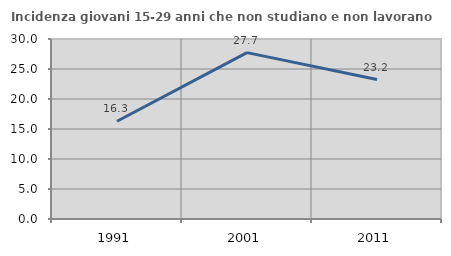
| Category | Incidenza giovani 15-29 anni che non studiano e non lavorano  |
|---|---|
| 1991.0 | 16.294 |
| 2001.0 | 27.726 |
| 2011.0 | 23.238 |